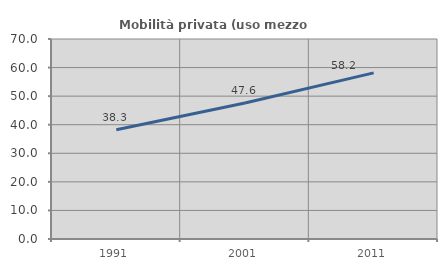
| Category | Mobilità privata (uso mezzo privato) |
|---|---|
| 1991.0 | 38.265 |
| 2001.0 | 47.619 |
| 2011.0 | 58.152 |